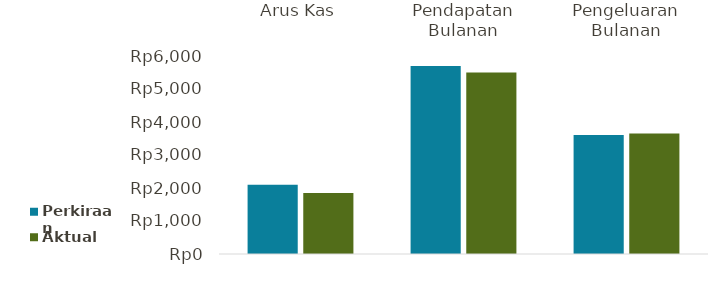
| Category | Perkiraan | Aktual |
|---|---|---|
| Arus Kas | 2097 | 1845 |
| Pendapatan Bulanan | 5700 | 5500 |
| Pengeluaran Bulanan | 3603 | 3655 |